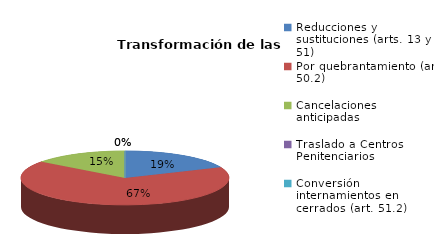
| Category | Series 0 |
|---|---|
| Reducciones y sustituciones (arts. 13 y 51) | 5 |
| Por quebrantamiento (art. 50.2) | 18 |
| Cancelaciones anticipadas | 4 |
| Traslado a Centros Penitenciarios | 0 |
| Conversión internamientos en cerrados (art. 51.2) | 0 |